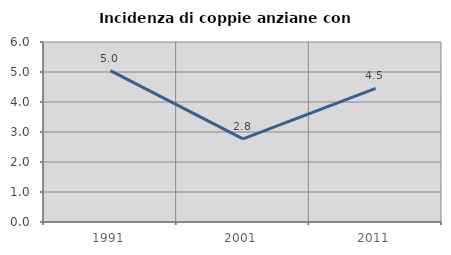
| Category | Incidenza di coppie anziane con figli |
|---|---|
| 1991.0 | 5.047 |
| 2001.0 | 2.769 |
| 2011.0 | 4.451 |